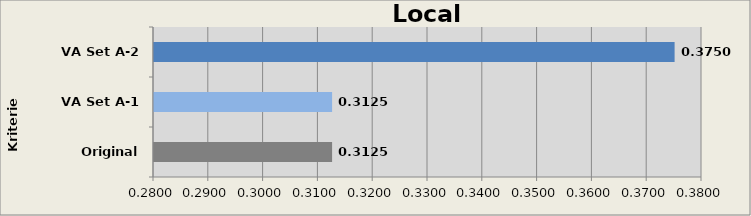
| Category | Local Operations |
|---|---|
| Original A-0 | 0.312 |
| VA Set A-1 | 0.312 |
| VA Set A-2 | 0.375 |